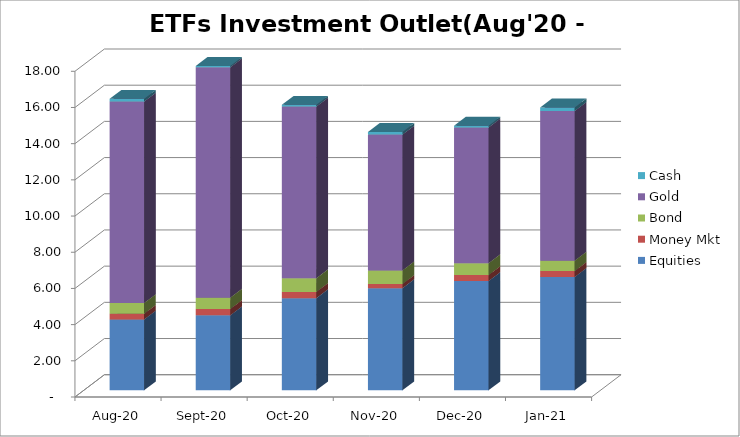
| Category | Equities | Money Mkt | Bond | Gold | Cash |
|---|---|---|---|---|---|
| 2020-08-01 | 3913723749.54 | 316071867.88 | 592621089.37 | 11135395115.33 | 152002086.71 |
| 2020-09-01 | 4141425949.9 | 349803623.89 | 626583310.45 | 12731001529.98 | 76107936.49 |
| 2020-10-01 | 5094516142.04 | 343013633.71 | 754956015.68 | 9489073502.64 | 94333366.41 |
| 2020-11-01 | 5645946017.69 | 225450504.88 | 753518055.25 | 7507451398.4 | 141335465.56 |
| 2020-12-01 | 6038222203.19 | 328434807.13 | 655620938.79 | 7507451398.4 | 97257264.43 |
| 2021-01-01 | 6261034928.78 | 328719643.75 | 576943023.25 | 8268148641.96 | 194194454.34 |